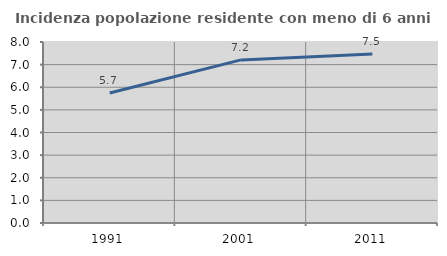
| Category | Incidenza popolazione residente con meno di 6 anni |
|---|---|
| 1991.0 | 5.748 |
| 2001.0 | 7.21 |
| 2011.0 | 7.469 |